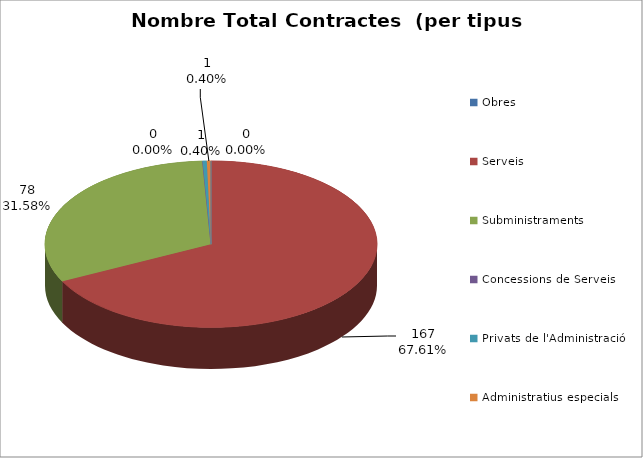
| Category | Nombre Total Contractes |
|---|---|
| Obres | 0 |
| Serveis | 167 |
| Subministraments | 78 |
| Concessions de Serveis | 0 |
| Privats de l'Administració | 1 |
| Administratius especials | 1 |